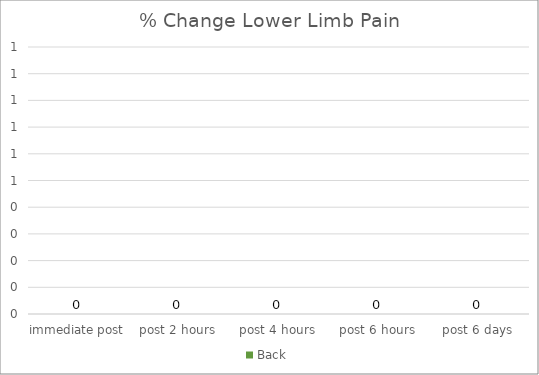
| Category | Back |
|---|---|
| immediate post | 0 |
| post 2 hours | 0 |
| post 4 hours | 0 |
| post 6 hours | 0 |
| post 6 days | 0 |